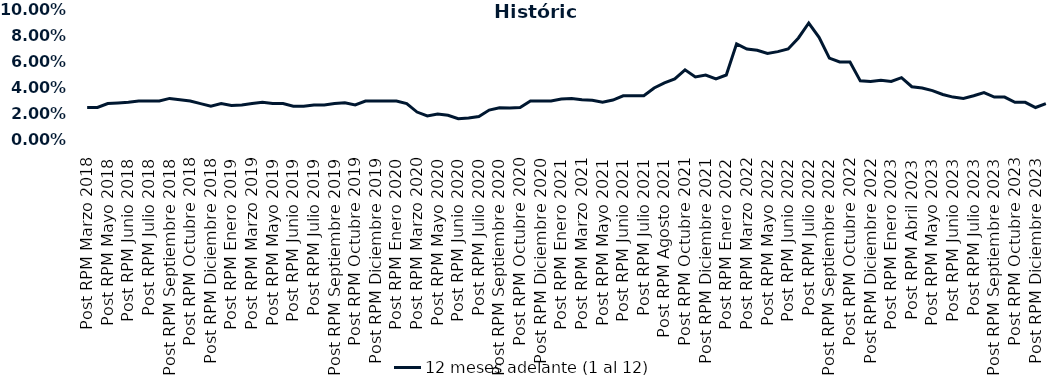
| Category | 12 meses adelante (1 al 12)  |
|---|---|
| Post RPM Marzo 2018 | 0.025 |
| Pre RPM Mayo 2018 | 0.025 |
| Post RPM Mayo 2018 | 0.028 |
| Pre RPM Junio 2018 | 0.028 |
| Post RPM Junio 2018 | 0.029 |
| Pre RPM Julio 2018 | 0.03 |
| Post RPM Julio 2018 | 0.03 |
| Pre RPM Septiembre 2018 | 0.03 |
| Post RPM Septiembre 2018 | 0.032 |
| Pre RPM Octubre 2018 | 0.031 |
| Post RPM Octubre 2018 | 0.03 |
| Pre RPM Diciembre 2018 | 0.028 |
| Post RPM Diciembre 2018 | 0.026 |
| Pre RPM Enero 2019 | 0.028 |
| Post RPM Enero 2019 | 0.026 |
| Pre RPM Marzo 2019 | 0.027 |
| Post RPM Marzo 2019 | 0.028 |
| Pre RPM Mayo 2019 | 0.029 |
| Post RPM Mayo 2019 | 0.028 |
| Pre RPM Junio 2019 | 0.028 |
| Post RPM Junio 2019 | 0.026 |
| Pre RPM Julio 2019 | 0.026 |
| Post RPM Julio 2019 | 0.027 |
| Pre RPM Septiembre 2019 | 0.027 |
| Post RPM Septiembre 2019 | 0.028 |
| Pre RPM Octubre 2019 | 0.029 |
| Post RPM Octubre 2019 | 0.027 |
| Pre RPM Diciembre 2019 | 0.03 |
| Post RPM Diciembre 2019 | 0.03 |
| Pre RPM Enero 2020 | 0.03 |
| Post RPM Enero 2020 | 0.03 |
| Pre RPM Marzo 2020 | 0.028 |
| Post RPM Marzo 2020 | 0.022 |
| Pre RPM Mayo 2020 | 0.018 |
| Post RPM Mayo 2020 | 0.02 |
| Pre RPM Junio 2020 | 0.019 |
| Post RPM Junio 2020 | 0.016 |
| Pre RPM Julio 2020 | 0.017 |
| Post RPM Julio 2020 | 0.018 |
| Pre RPM Septiembre 2020 | 0.023 |
| Post RPM Septiembre 2020 | 0.025 |
| Pre RPM Octubre 2020 | 0.025 |
| Post RPM Octubre 2020 | 0.025 |
| Pre RPM Diciembre 2020 | 0.03 |
| Post RPM Diciembre 2020 | 0.03 |
| Pre RPM Enero 2021 | 0.03 |
| Post RPM Enero 2021 | 0.032 |
| Pre RPM Marzo 2021 | 0.032 |
| Post RPM Marzo 2021 | 0.031 |
| Pre RPM Mayo 2021 | 0.03 |
| Post RPM Mayo 2021 | 0.029 |
| Pre RPM Junio 2021 | 0.031 |
| Post RPM Junio 2021 | 0.034 |
| Pre RPM Julio 2021 | 0.034 |
| Post RPM Julio 2021 | 0.034 |
| Pre RPM Agosto 2021 | 0.04 |
| Post RPM Agosto 2021 | 0.044 |
| Pre RPM Octubre 2021 | 0.047 |
| Post RPM Octubre 2021 | 0.054 |
| Pre RPM Diciembre 2021 | 0.048 |
| Post RPM Diciembre 2021 | 0.05 |
| Pre RPM Enero 2022 | 0.047 |
| Post RPM Enero 2022 | 0.05 |
| Pre RPM Marzo 2022 | 0.074 |
| Post RPM Marzo 2022 | 0.07 |
| Pre RPM Mayo 2022 | 0.069 |
| Post RPM Mayo 2022 | 0.066 |
| Pre RPM Junio 2022 | 0.068 |
| Post RPM Junio 2022 | 0.07 |
| Pre RPM Julio 2022 | 0.078 |
| Post RPM Julio 2022 | 0.09 |
| Pre RPM Septiembre 2022 | 0.079 |
| Post RPM Septiembre 2022 | 0.063 |
| Pre RPM Octubre 2022 | 0.06 |
| Post RPM Octubre 2022 | 0.06 |
| Pre RPM Diciembre 2022 | 0.046 |
| Post RPM Diciembre 2022 | 0.045 |
| Pre RPM Enero 2023 | 0.046 |
| Post RPM Enero 2023 | 0.045 |
| Pre RPM Abril 2023 | 0.048 |
| Post RPM Abril 2023 | 0.041 |
| Pre RPM Mayo 2023 | 0.04 |
| Post RPM Mayo 2023 | 0.038 |
| Pre RPM Junio 2023 | 0.035 |
| Post RPM Junio 2023 | 0.033 |
| Pre RPM Julio 2023 | 0.032 |
| Post RPM Julio 2023 | 0.034 |
| Pre RPM Septiembre 2023 | 0.036 |
| Post RPM Septiembre 2023 | 0.033 |
| Pre RPM Octubre 2023 | 0.033 |
| Post RPM Octubre 2023 | 0.029 |
| Pre RPM Diciembre 2023 | 0.029 |
| Post RPM Diciembre 2023 | 0.025 |
| Pre RPM Enero 2024 | 0.028 |